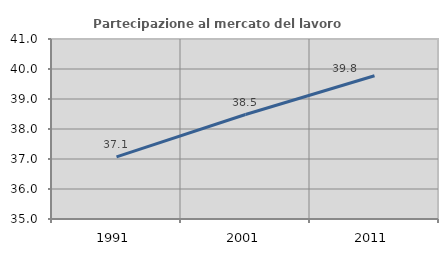
| Category | Partecipazione al mercato del lavoro  femminile |
|---|---|
| 1991.0 | 37.072 |
| 2001.0 | 38.483 |
| 2011.0 | 39.776 |